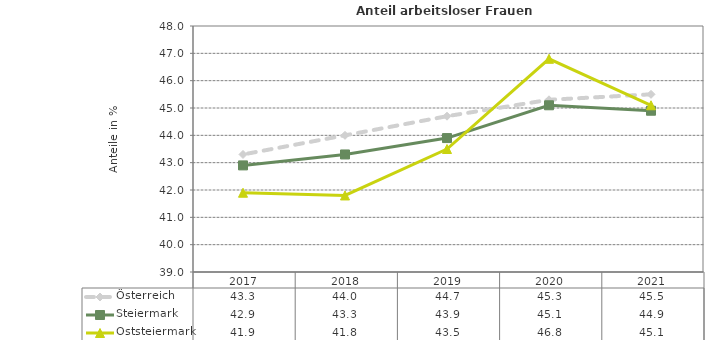
| Category | Österreich | Steiermark | Oststeiermark |
|---|---|---|---|
| 2021.0 | 45.5 | 44.9 | 45.1 |
| 2020.0 | 45.3 | 45.1 | 46.8 |
| 2019.0 | 44.7 | 43.9 | 43.5 |
| 2018.0 | 44 | 43.3 | 41.8 |
| 2017.0 | 43.3 | 42.9 | 41.9 |